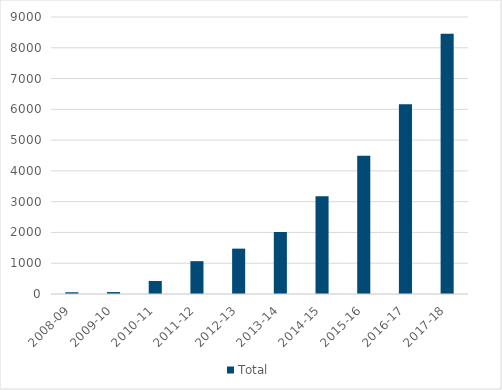
| Category | Total |
|---|---|
| 2008-09 | 57 |
| 2009-10 | 63 |
| 2010-11 | 423 |
| 2011-12 | 1067 |
| 2012-13 | 1474 |
| 2013-14 | 2014 |
| 2014-15 | 3177 |
| 2015-16 | 4490 |
| 2016-17 | 6166 |
| 2017-18 | 8457 |